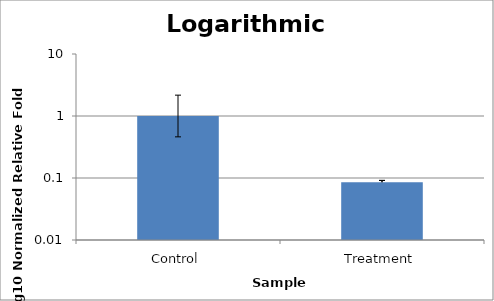
| Category | Series 0 |
|---|---|
| Control | 1 |
| Treatment | 0.085 |